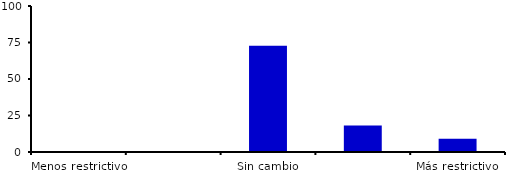
| Category | Series 0 |
|---|---|
| Menos restrictivo | 0 |
| Moderadamente menos restrictivo | 0 |
| Sin cambio | 72.727 |
| Moderadamente más restrictivo | 18.182 |
| Más restrictivo | 9.091 |